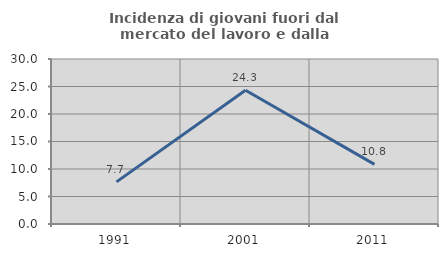
| Category | Incidenza di giovani fuori dal mercato del lavoro e dalla formazione  |
|---|---|
| 1991.0 | 7.661 |
| 2001.0 | 24.324 |
| 2011.0 | 10.848 |